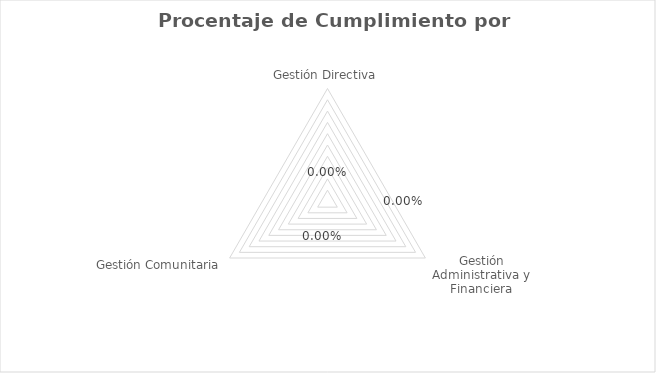
| Category | Series 0 |
|---|---|
| Gestión Directiva | 0 |
| Gestión Administrativa y Financiera | 0 |
| Gestión Comunitaria | 0 |